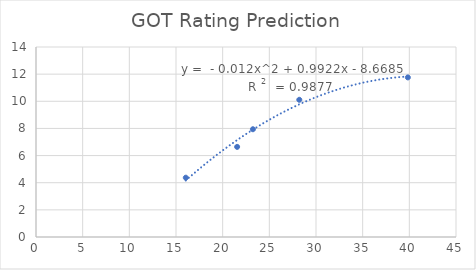
| Category | Series 0 |
|---|---|
| 16.05 | 4.37 |
| 21.55 | 6.64 |
| 23.24 | 7.94 |
| 28.21 | 10.11 |
| 39.84 | 11.76 |